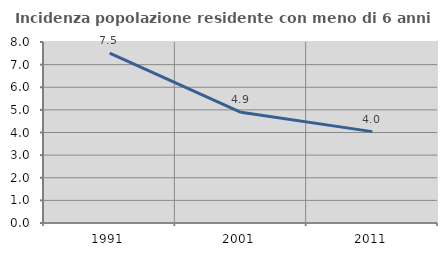
| Category | Incidenza popolazione residente con meno di 6 anni |
|---|---|
| 1991.0 | 7.509 |
| 2001.0 | 4.893 |
| 2011.0 | 4.038 |